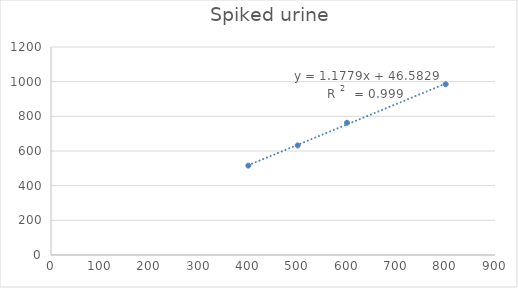
| Category | Series 0 |
|---|---|
| 400.0 | 515.6 |
| 500.0 | 632 |
| 600.0 | 763 |
| 800.0 | 985 |